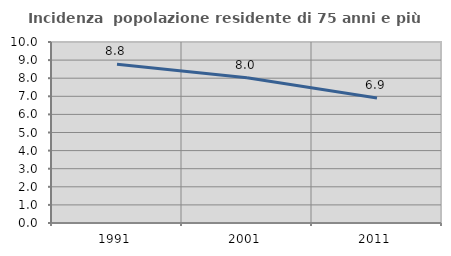
| Category | Incidenza  popolazione residente di 75 anni e più |
|---|---|
| 1991.0 | 8.775 |
| 2001.0 | 8.026 |
| 2011.0 | 6.906 |